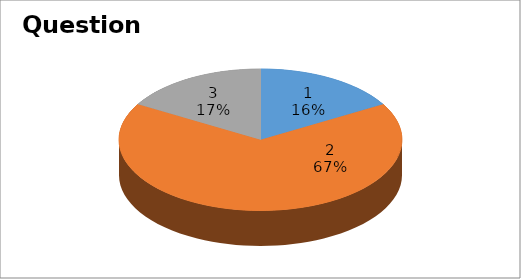
| Category | Series 0 |
|---|---|
| 0 | 1 |
| 1 | 4 |
| 2 | 1 |